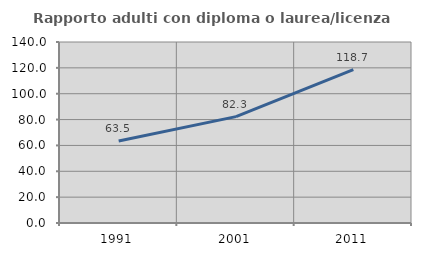
| Category | Rapporto adulti con diploma o laurea/licenza media  |
|---|---|
| 1991.0 | 63.468 |
| 2001.0 | 82.274 |
| 2011.0 | 118.673 |